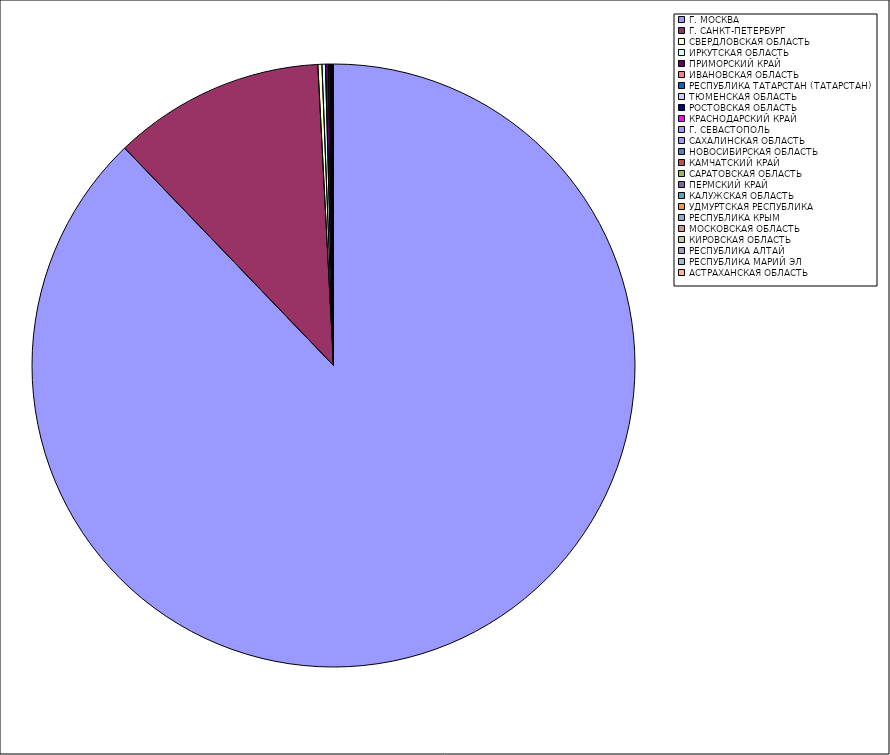
| Category | Оборот |
|---|---|
| Г. МОСКВА | 87.807 |
| Г. САНКТ-ПЕТЕРБУРГ | 11.351 |
| СВЕРДЛОВСКАЯ ОБЛАСТЬ | 0.217 |
| ИРКУТСКАЯ ОБЛАСТЬ | 0.185 |
| ПРИМОРСКИЙ КРАЙ | 0.155 |
| ИВАНОВСКАЯ ОБЛАСТЬ | 0.074 |
| РЕСПУБЛИКА ТАТАРСТАН (ТАТАРСТАН) | 0.034 |
| ТЮМЕНСКАЯ ОБЛАСТЬ | 0.026 |
| РОСТОВСКАЯ ОБЛАСТЬ | 0.026 |
| КРАСНОДАРСКИЙ КРАЙ | 0.025 |
| Г. СЕВАСТОПОЛЬ | 0.021 |
| САХАЛИНСКАЯ ОБЛАСТЬ | 0.012 |
| НОВОСИБИРСКАЯ ОБЛАСТЬ | 0.01 |
| КАМЧАТСКИЙ КРАЙ | 0.006 |
| САРАТОВСКАЯ ОБЛАСТЬ | 0.006 |
| ПЕРМСКИЙ КРАЙ | 0.005 |
| КАЛУЖСКАЯ ОБЛАСТЬ | 0.005 |
| УДМУРТСКАЯ РЕСПУБЛИКА | 0.005 |
| РЕСПУБЛИКА КРЫМ | 0.004 |
| МОСКОВСКАЯ ОБЛАСТЬ | 0.003 |
| КИРОВСКАЯ ОБЛАСТЬ | 0.003 |
| РЕСПУБЛИКА АЛТАЙ | 0.003 |
| РЕСПУБЛИКА МАРИЙ ЭЛ | 0.002 |
| АСТРАХАНСКАЯ ОБЛАСТЬ | 0.002 |